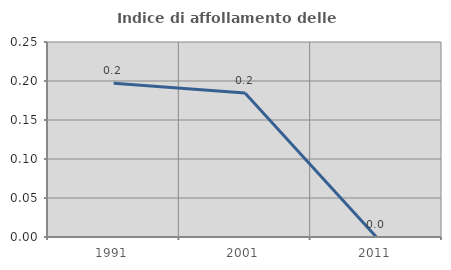
| Category | Indice di affollamento delle abitazioni  |
|---|---|
| 1991.0 | 0.197 |
| 2001.0 | 0.185 |
| 2011.0 | 0 |